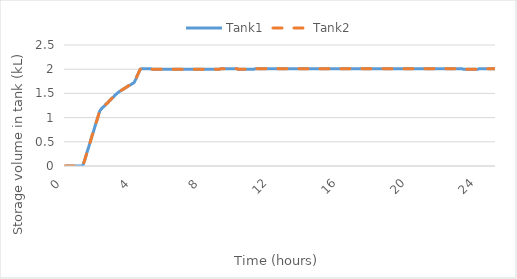
| Category | Tank1 | Tank2 |
|---|---|---|
| 0.0 | 0 | 0 |
| 0.016666666666666666 | 0 | 0 |
| 0.03333333333333333 | 0 | 0 |
| 0.05 | 0 | 0 |
| 0.06666666666666667 | 0 | 0 |
| 0.08333333333333333 | 0 | 0 |
| 0.09999999999999999 | 0 | 0 |
| 0.11666666666666665 | 0 | 0 |
| 0.13333333333333333 | 0 | 0 |
| 0.15 | 0 | 0 |
| 0.16666666666666666 | 0 | 0 |
| 0.18333333333333332 | 0 | 0 |
| 0.19999999999999998 | 0 | 0 |
| 0.21666666666666665 | 0 | 0 |
| 0.2333333333333333 | 0 | 0 |
| 0.24999999999999997 | 0 | 0 |
| 0.26666666666666666 | 0 | 0 |
| 0.2833333333333333 | 0 | 0 |
| 0.3 | 0 | 0 |
| 0.31666666666666665 | 0 | 0 |
| 0.3333333333333333 | 0 | 0 |
| 0.35 | 0 | 0 |
| 0.36666666666666664 | 0 | 0 |
| 0.3833333333333333 | 0 | 0 |
| 0.39999999999999997 | 0 | 0 |
| 0.41666666666666663 | 0 | 0 |
| 0.4333333333333333 | 0 | 0 |
| 0.44999999999999996 | 0 | 0 |
| 0.4666666666666666 | 0 | 0 |
| 0.4833333333333333 | 0 | 0 |
| 0.49999999999999994 | 0 | 0 |
| 0.5166666666666666 | 0 | 0 |
| 0.5333333333333333 | 0 | 0 |
| 0.55 | 0 | 0 |
| 0.5666666666666668 | 0 | 0 |
| 0.5833333333333335 | 0 | 0 |
| 0.6000000000000002 | 0 | 0 |
| 0.6166666666666669 | 0 | 0 |
| 0.6333333333333336 | 0 | 0 |
| 0.6500000000000004 | 0 | 0 |
| 0.6666666666666671 | 0 | 0 |
| 0.6833333333333338 | 0 | 0 |
| 0.7000000000000005 | 0 | 0 |
| 0.7166666666666672 | 0 | 0 |
| 0.733333333333334 | 0 | 0 |
| 0.7500000000000007 | 0 | 0 |
| 0.7666666666666674 | 0 | 0 |
| 0.7833333333333341 | 0 | 0 |
| 0.8000000000000008 | 0 | 0 |
| 0.8166666666666675 | 0 | 0 |
| 0.8333333333333343 | 0 | 0 |
| 0.850000000000001 | 0 | 0 |
| 0.8666666666666677 | 0 | 0 |
| 0.8833333333333344 | 0 | 0 |
| 0.9000000000000011 | 0 | 0 |
| 0.9166666666666679 | 0 | 0 |
| 0.9333333333333346 | 0 | 0 |
| 0.9500000000000013 | 0 | 0 |
| 0.966666666666668 | 0 | 0 |
| 0.9833333333333347 | 0 | 0 |
| 1.0000000000000013 | 0 | 0 |
| 1.016666666666668 | 0.01 | 0.01 |
| 1.0333333333333345 | 0.02 | 0.02 |
| 1.0500000000000012 | 0.03 | 0.03 |
| 1.0666666666666678 | 0.05 | 0.05 |
| 1.0833333333333344 | 0.07 | 0.07 |
| 1.100000000000001 | 0.08 | 0.08 |
| 1.1166666666666676 | 0.1 | 0.1 |
| 1.1333333333333342 | 0.12 | 0.12 |
| 1.1500000000000008 | 0.14 | 0.14 |
| 1.1666666666666674 | 0.16 | 0.16 |
| 1.183333333333334 | 0.18 | 0.18 |
| 1.2000000000000006 | 0.2 | 0.2 |
| 1.2166666666666672 | 0.22 | 0.22 |
| 1.2333333333333338 | 0.24 | 0.24 |
| 1.2500000000000004 | 0.26 | 0.26 |
| 1.266666666666667 | 0.28 | 0.28 |
| 1.2833333333333337 | 0.3 | 0.3 |
| 1.3000000000000003 | 0.32 | 0.32 |
| 1.3166666666666669 | 0.34 | 0.34 |
| 1.3333333333333335 | 0.35 | 0.35 |
| 1.35 | 0.37 | 0.37 |
| 1.3666666666666667 | 0.39 | 0.39 |
| 1.3833333333333333 | 0.41 | 0.41 |
| 1.4 | 0.43 | 0.43 |
| 1.4166666666666665 | 0.45 | 0.45 |
| 1.4333333333333331 | 0.47 | 0.47 |
| 1.4499999999999997 | 0.49 | 0.49 |
| 1.4666666666666663 | 0.51 | 0.51 |
| 1.483333333333333 | 0.53 | 0.53 |
| 1.4999999999999996 | 0.55 | 0.55 |
| 1.5166666666666662 | 0.57 | 0.57 |
| 1.5333333333333328 | 0.59 | 0.59 |
| 1.5499999999999994 | 0.61 | 0.61 |
| 1.566666666666666 | 0.63 | 0.63 |
| 1.5833333333333326 | 0.65 | 0.65 |
| 1.5999999999999992 | 0.66 | 0.66 |
| 1.6166666666666658 | 0.68 | 0.68 |
| 1.6333333333333324 | 0.7 | 0.7 |
| 1.649999999999999 | 0.72 | 0.72 |
| 1.6666666666666656 | 0.74 | 0.74 |
| 1.6833333333333322 | 0.76 | 0.76 |
| 1.6999999999999988 | 0.78 | 0.78 |
| 1.7166666666666655 | 0.8 | 0.8 |
| 1.733333333333332 | 0.82 | 0.82 |
| 1.7499999999999987 | 0.84 | 0.84 |
| 1.7666666666666653 | 0.86 | 0.86 |
| 1.7833333333333319 | 0.88 | 0.88 |
| 1.7999999999999985 | 0.9 | 0.9 |
| 1.816666666666665 | 0.92 | 0.92 |
| 1.8333333333333317 | 0.94 | 0.94 |
| 1.8499999999999983 | 0.95 | 0.95 |
| 1.866666666666665 | 0.97 | 0.97 |
| 1.8833333333333315 | 0.99 | 0.99 |
| 1.8999999999999981 | 1.01 | 1.01 |
| 1.9166666666666647 | 1.03 | 1.03 |
| 1.9333333333333313 | 1.05 | 1.05 |
| 1.949999999999998 | 1.07 | 1.07 |
| 1.9666666666666646 | 1.09 | 1.09 |
| 1.9833333333333312 | 1.11 | 1.11 |
| 1.9999999999999978 | 1.13 | 1.13 |
| 2.0166666666666644 | 1.14 | 1.14 |
| 2.033333333333331 | 1.15 | 1.15 |
| 2.0499999999999976 | 1.16 | 1.16 |
| 2.066666666666664 | 1.16 | 1.16 |
| 2.083333333333331 | 1.17 | 1.17 |
| 2.0999999999999974 | 1.18 | 1.18 |
| 2.116666666666664 | 1.18 | 1.18 |
| 2.1333333333333306 | 1.19 | 1.19 |
| 2.1499999999999972 | 1.2 | 1.2 |
| 2.166666666666664 | 1.2 | 1.2 |
| 2.1833333333333305 | 1.21 | 1.21 |
| 2.199999999999997 | 1.21 | 1.21 |
| 2.2166666666666637 | 1.22 | 1.22 |
| 2.2333333333333303 | 1.23 | 1.23 |
| 2.249999999999997 | 1.23 | 1.23 |
| 2.2666666666666635 | 1.24 | 1.24 |
| 2.28333333333333 | 1.24 | 1.24 |
| 2.2999999999999967 | 1.25 | 1.25 |
| 2.3166666666666633 | 1.26 | 1.26 |
| 2.33333333333333 | 1.26 | 1.26 |
| 2.3499999999999965 | 1.27 | 1.27 |
| 2.366666666666663 | 1.27 | 1.27 |
| 2.3833333333333298 | 1.28 | 1.28 |
| 2.3999999999999964 | 1.29 | 1.29 |
| 2.416666666666663 | 1.29 | 1.29 |
| 2.4333333333333296 | 1.3 | 1.3 |
| 2.449999999999996 | 1.3 | 1.3 |
| 2.466666666666663 | 1.31 | 1.31 |
| 2.4833333333333294 | 1.31 | 1.31 |
| 2.499999999999996 | 1.32 | 1.32 |
| 2.5166666666666626 | 1.33 | 1.33 |
| 2.533333333333329 | 1.33 | 1.33 |
| 2.549999999999996 | 1.34 | 1.34 |
| 2.5666666666666624 | 1.34 | 1.34 |
| 2.583333333333329 | 1.35 | 1.35 |
| 2.5999999999999956 | 1.36 | 1.36 |
| 2.6166666666666623 | 1.36 | 1.36 |
| 2.633333333333329 | 1.37 | 1.37 |
| 2.6499999999999955 | 1.37 | 1.37 |
| 2.666666666666662 | 1.38 | 1.38 |
| 2.6833333333333287 | 1.39 | 1.39 |
| 2.6999999999999953 | 1.39 | 1.39 |
| 2.716666666666662 | 1.4 | 1.4 |
| 2.7333333333333285 | 1.4 | 1.4 |
| 2.749999999999995 | 1.41 | 1.41 |
| 2.7666666666666617 | 1.42 | 1.42 |
| 2.7833333333333283 | 1.42 | 1.42 |
| 2.799999999999995 | 1.43 | 1.43 |
| 2.8166666666666615 | 1.43 | 1.43 |
| 2.833333333333328 | 1.44 | 1.44 |
| 2.8499999999999948 | 1.45 | 1.45 |
| 2.8666666666666614 | 1.45 | 1.45 |
| 2.883333333333328 | 1.46 | 1.46 |
| 2.8999999999999946 | 1.46 | 1.46 |
| 2.916666666666661 | 1.47 | 1.47 |
| 2.933333333333328 | 1.48 | 1.48 |
| 2.9499999999999944 | 1.48 | 1.48 |
| 2.966666666666661 | 1.49 | 1.49 |
| 2.9833333333333276 | 1.49 | 1.49 |
| 2.9999999999999942 | 1.5 | 1.5 |
| 3.016666666666661 | 1.5 | 1.5 |
| 3.0333333333333274 | 1.51 | 1.51 |
| 3.049999999999994 | 1.51 | 1.51 |
| 3.0666666666666607 | 1.52 | 1.52 |
| 3.0833333333333273 | 1.52 | 1.52 |
| 3.099999999999994 | 1.52 | 1.52 |
| 3.1166666666666605 | 1.53 | 1.53 |
| 3.133333333333327 | 1.53 | 1.53 |
| 3.1499999999999937 | 1.54 | 1.54 |
| 3.1666666666666603 | 1.54 | 1.54 |
| 3.183333333333327 | 1.54 | 1.54 |
| 3.1999999999999935 | 1.55 | 1.55 |
| 3.21666666666666 | 1.55 | 1.55 |
| 3.2333333333333267 | 1.55 | 1.55 |
| 3.2499999999999933 | 1.56 | 1.56 |
| 3.26666666666666 | 1.56 | 1.56 |
| 3.2833333333333266 | 1.57 | 1.57 |
| 3.299999999999993 | 1.57 | 1.57 |
| 3.3166666666666598 | 1.57 | 1.57 |
| 3.3333333333333264 | 1.58 | 1.58 |
| 3.349999999999993 | 1.58 | 1.58 |
| 3.3666666666666596 | 1.58 | 1.58 |
| 3.383333333333326 | 1.59 | 1.59 |
| 3.399999999999993 | 1.59 | 1.59 |
| 3.4166666666666594 | 1.6 | 1.6 |
| 3.433333333333326 | 1.6 | 1.6 |
| 3.4499999999999926 | 1.6 | 1.6 |
| 3.4666666666666592 | 1.61 | 1.61 |
| 3.483333333333326 | 1.61 | 1.61 |
| 3.4999999999999925 | 1.61 | 1.61 |
| 3.516666666666659 | 1.62 | 1.62 |
| 3.5333333333333257 | 1.62 | 1.62 |
| 3.5499999999999923 | 1.63 | 1.63 |
| 3.566666666666659 | 1.63 | 1.63 |
| 3.5833333333333255 | 1.63 | 1.63 |
| 3.599999999999992 | 1.64 | 1.64 |
| 3.6166666666666587 | 1.64 | 1.64 |
| 3.6333333333333253 | 1.64 | 1.64 |
| 3.649999999999992 | 1.65 | 1.65 |
| 3.6666666666666585 | 1.65 | 1.65 |
| 3.683333333333325 | 1.66 | 1.66 |
| 3.6999999999999917 | 1.66 | 1.66 |
| 3.7166666666666583 | 1.66 | 1.66 |
| 3.733333333333325 | 1.67 | 1.67 |
| 3.7499999999999916 | 1.67 | 1.67 |
| 3.766666666666658 | 1.67 | 1.67 |
| 3.7833333333333248 | 1.68 | 1.68 |
| 3.7999999999999914 | 1.68 | 1.68 |
| 3.816666666666658 | 1.68 | 1.68 |
| 3.8333333333333246 | 1.69 | 1.69 |
| 3.849999999999991 | 1.69 | 1.69 |
| 3.866666666666658 | 1.7 | 1.7 |
| 3.8833333333333244 | 1.7 | 1.7 |
| 3.899999999999991 | 1.7 | 1.7 |
| 3.9166666666666576 | 1.71 | 1.71 |
| 3.9333333333333242 | 1.71 | 1.71 |
| 3.949999999999991 | 1.71 | 1.71 |
| 3.9666666666666575 | 1.72 | 1.72 |
| 3.983333333333324 | 1.72 | 1.72 |
| 3.9999999999999907 | 1.73 | 1.73 |
| 4.016666666666658 | 1.73 | 1.73 |
| 4.033333333333324 | 1.74 | 1.74 |
| 4.049999999999991 | 1.76 | 1.76 |
| 4.0666666666666575 | 1.77 | 1.77 |
| 4.083333333333324 | 1.78 | 1.78 |
| 4.099999999999991 | 1.79 | 1.79 |
| 4.116666666666657 | 1.81 | 1.81 |
| 4.133333333333324 | 1.82 | 1.82 |
| 4.149999999999991 | 1.83 | 1.83 |
| 4.166666666666657 | 1.85 | 1.85 |
| 4.183333333333324 | 1.86 | 1.86 |
| 4.19999999999999 | 1.87 | 1.87 |
| 4.216666666666657 | 1.89 | 1.89 |
| 4.233333333333324 | 1.9 | 1.9 |
| 4.24999999999999 | 1.91 | 1.91 |
| 4.266666666666657 | 1.93 | 1.93 |
| 4.2833333333333234 | 1.94 | 1.94 |
| 4.29999999999999 | 1.95 | 1.95 |
| 4.316666666666657 | 1.97 | 1.97 |
| 4.333333333333323 | 1.98 | 1.98 |
| 4.34999999999999 | 1.99 | 1.99 |
| 4.3666666666666565 | 2 | 2 |
| 4.383333333333323 | 2.01 | 2.01 |
| 4.39999999999999 | 2.01 | 2.01 |
| 4.416666666666656 | 2.01 | 2.01 |
| 4.433333333333323 | 2.01 | 2.01 |
| 4.4499999999999895 | 2.01 | 2.01 |
| 4.466666666666656 | 2.01 | 2.01 |
| 4.483333333333323 | 2.01 | 2.01 |
| 4.499999999999989 | 2.01 | 2.01 |
| 4.516666666666656 | 2.01 | 2.01 |
| 4.533333333333323 | 2.01 | 2.01 |
| 4.549999999999989 | 2.01 | 2.01 |
| 4.566666666666656 | 2.01 | 2.01 |
| 4.583333333333322 | 2.01 | 2.01 |
| 4.599999999999989 | 2.01 | 2.01 |
| 4.616666666666656 | 2.01 | 2.01 |
| 4.633333333333322 | 2.01 | 2.01 |
| 4.649999999999989 | 2.01 | 2.01 |
| 4.666666666666655 | 2.01 | 2.01 |
| 4.683333333333322 | 2.01 | 2.01 |
| 4.699999999999989 | 2.01 | 2.01 |
| 4.716666666666655 | 2.01 | 2.01 |
| 4.733333333333322 | 2.01 | 2.01 |
| 4.7499999999999885 | 2.01 | 2.01 |
| 4.766666666666655 | 2.01 | 2.01 |
| 4.783333333333322 | 2.01 | 2.01 |
| 4.799999999999988 | 2.01 | 2.01 |
| 4.816666666666655 | 2.01 | 2.01 |
| 4.8333333333333215 | 2.01 | 2.01 |
| 4.849999999999988 | 2.01 | 2.01 |
| 4.866666666666655 | 2.01 | 2.01 |
| 4.883333333333321 | 2.01 | 2.01 |
| 4.899999999999988 | 2.01 | 2.01 |
| 4.9166666666666545 | 2.01 | 2.01 |
| 4.933333333333321 | 2.01 | 2.01 |
| 4.949999999999988 | 2.01 | 2.01 |
| 4.966666666666654 | 2.01 | 2.01 |
| 4.983333333333321 | 2.01 | 2.01 |
| 4.999999999999988 | 2.01 | 2.01 |
| 5.016666666666654 | 2 | 2 |
| 5.033333333333321 | 2 | 2 |
| 5.049999999999987 | 2 | 2 |
| 5.066666666666654 | 2 | 2 |
| 5.083333333333321 | 2 | 2 |
| 5.099999999999987 | 2 | 2 |
| 5.116666666666654 | 2 | 2 |
| 5.13333333333332 | 2 | 2 |
| 5.149999999999987 | 2 | 2 |
| 5.166666666666654 | 2 | 2 |
| 5.18333333333332 | 2 | 2 |
| 5.199999999999987 | 2 | 2 |
| 5.2166666666666535 | 2 | 2 |
| 5.23333333333332 | 2 | 2 |
| 5.249999999999987 | 2 | 2 |
| 5.266666666666653 | 2 | 2 |
| 5.28333333333332 | 2 | 2 |
| 5.2999999999999865 | 2 | 2 |
| 5.316666666666653 | 2 | 2 |
| 5.33333333333332 | 2 | 2 |
| 5.349999999999986 | 2 | 2 |
| 5.366666666666653 | 2 | 2 |
| 5.3833333333333195 | 2 | 2 |
| 5.399999999999986 | 2 | 2 |
| 5.416666666666653 | 2 | 2 |
| 5.433333333333319 | 2 | 2 |
| 5.449999999999986 | 2 | 2 |
| 5.466666666666653 | 2 | 2 |
| 5.483333333333319 | 2 | 2 |
| 5.499999999999986 | 2 | 2 |
| 5.516666666666652 | 2 | 2 |
| 5.533333333333319 | 2 | 2 |
| 5.549999999999986 | 2 | 2 |
| 5.566666666666652 | 2 | 2 |
| 5.583333333333319 | 2 | 2 |
| 5.599999999999985 | 2 | 2 |
| 5.616666666666652 | 2 | 2 |
| 5.633333333333319 | 2 | 2 |
| 5.649999999999985 | 2 | 2 |
| 5.666666666666652 | 2 | 2 |
| 5.6833333333333185 | 2 | 2 |
| 5.699999999999985 | 2 | 2 |
| 5.716666666666652 | 2 | 2 |
| 5.733333333333318 | 2 | 2 |
| 5.749999999999985 | 2 | 2 |
| 5.7666666666666515 | 2 | 2 |
| 5.783333333333318 | 2 | 2 |
| 5.799999999999985 | 2 | 2 |
| 5.816666666666651 | 2 | 2 |
| 5.833333333333318 | 2 | 2 |
| 5.8499999999999845 | 2 | 2 |
| 5.866666666666651 | 2 | 2 |
| 5.883333333333318 | 2 | 2 |
| 5.899999999999984 | 2 | 2 |
| 5.916666666666651 | 2 | 2 |
| 5.933333333333318 | 2 | 2 |
| 5.949999999999984 | 2 | 2 |
| 5.966666666666651 | 2 | 2 |
| 5.983333333333317 | 2 | 2 |
| 5.999999999999984 | 2 | 2 |
| 6.016666666666651 | 2 | 2 |
| 6.033333333333317 | 2 | 2 |
| 6.049999999999984 | 2 | 2 |
| 6.06666666666665 | 2 | 2 |
| 6.083333333333317 | 2 | 2 |
| 6.099999999999984 | 2 | 2 |
| 6.11666666666665 | 2 | 2 |
| 6.133333333333317 | 2 | 2 |
| 6.1499999999999835 | 2 | 2 |
| 6.16666666666665 | 2 | 2 |
| 6.183333333333317 | 2 | 2 |
| 6.199999999999983 | 2 | 2 |
| 6.21666666666665 | 2 | 2 |
| 6.2333333333333165 | 2 | 2 |
| 6.249999999999983 | 2 | 2 |
| 6.26666666666665 | 2 | 2 |
| 6.283333333333316 | 2 | 2 |
| 6.299999999999983 | 2 | 2 |
| 6.3166666666666496 | 2 | 2 |
| 6.333333333333316 | 2 | 2 |
| 6.349999999999983 | 2 | 2 |
| 6.366666666666649 | 2 | 2 |
| 6.383333333333316 | 2 | 2 |
| 6.399999999999983 | 2 | 2 |
| 6.416666666666649 | 2 | 2 |
| 6.433333333333316 | 2 | 2 |
| 6.449999999999982 | 2 | 2 |
| 6.466666666666649 | 2 | 2 |
| 6.483333333333316 | 2 | 2 |
| 6.499999999999982 | 2 | 2 |
| 6.516666666666649 | 2 | 2 |
| 6.5333333333333155 | 2 | 2 |
| 6.549999999999982 | 2 | 2 |
| 6.566666666666649 | 2 | 2 |
| 6.583333333333315 | 2 | 2 |
| 6.599999999999982 | 2 | 2 |
| 6.6166666666666485 | 2 | 2 |
| 6.633333333333315 | 2 | 2 |
| 6.649999999999982 | 2 | 2 |
| 6.666666666666648 | 2 | 2 |
| 6.683333333333315 | 2 | 2 |
| 6.6999999999999815 | 2 | 2 |
| 6.716666666666648 | 2 | 2 |
| 6.733333333333315 | 2 | 2 |
| 6.749999999999981 | 2 | 2 |
| 6.766666666666648 | 2 | 2 |
| 6.783333333333315 | 2 | 2 |
| 6.799999999999981 | 2 | 2 |
| 6.816666666666648 | 2 | 2 |
| 6.833333333333314 | 2 | 2 |
| 6.849999999999981 | 2 | 2 |
| 6.866666666666648 | 2 | 2 |
| 6.883333333333314 | 2 | 2 |
| 6.899999999999981 | 2 | 2 |
| 6.916666666666647 | 2 | 2 |
| 6.933333333333314 | 2 | 2 |
| 6.949999999999981 | 2 | 2 |
| 6.966666666666647 | 2 | 2 |
| 6.983333333333314 | 2 | 2 |
| 6.9999999999999805 | 2 | 2 |
| 7.016666666666647 | 2 | 2 |
| 7.033333333333314 | 2 | 2 |
| 7.04999999999998 | 2 | 2 |
| 7.066666666666647 | 2 | 2 |
| 7.0833333333333135 | 2 | 2 |
| 7.09999999999998 | 2 | 2 |
| 7.116666666666647 | 2 | 2 |
| 7.133333333333313 | 2 | 2 |
| 7.14999999999998 | 2 | 2 |
| 7.1666666666666465 | 2 | 2 |
| 7.183333333333313 | 2 | 2 |
| 7.19999999999998 | 2 | 2 |
| 7.216666666666646 | 2 | 2 |
| 7.233333333333313 | 2 | 2 |
| 7.24999999999998 | 2 | 2 |
| 7.266666666666646 | 2 | 2 |
| 7.283333333333313 | 2 | 2 |
| 7.299999999999979 | 2 | 2 |
| 7.316666666666646 | 2 | 2 |
| 7.333333333333313 | 2 | 2 |
| 7.349999999999979 | 2 | 2 |
| 7.366666666666646 | 2 | 2 |
| 7.383333333333312 | 2 | 2 |
| 7.399999999999979 | 2 | 2 |
| 7.416666666666646 | 2 | 2 |
| 7.433333333333312 | 2 | 2 |
| 7.449999999999979 | 2 | 2 |
| 7.4666666666666455 | 2 | 2 |
| 7.483333333333312 | 2 | 2 |
| 7.499999999999979 | 2 | 2 |
| 7.516666666666645 | 2 | 2 |
| 7.533333333333312 | 2 | 2 |
| 7.5499999999999785 | 2 | 2 |
| 7.566666666666645 | 2 | 2 |
| 7.583333333333312 | 2 | 2 |
| 7.599999999999978 | 2 | 2 |
| 7.616666666666645 | 2 | 2 |
| 7.6333333333333115 | 2 | 2 |
| 7.649999999999978 | 2 | 2 |
| 7.666666666666645 | 2 | 2 |
| 7.683333333333311 | 2 | 2 |
| 7.699999999999978 | 2 | 2 |
| 7.716666666666645 | 2 | 2 |
| 7.733333333333311 | 2 | 2 |
| 7.749999999999978 | 2 | 2 |
| 7.766666666666644 | 2 | 2 |
| 7.783333333333311 | 2 | 2 |
| 7.799999999999978 | 2 | 2 |
| 7.816666666666644 | 2 | 2 |
| 7.833333333333311 | 2 | 2 |
| 7.849999999999977 | 2 | 2 |
| 7.866666666666644 | 2 | 2 |
| 7.883333333333311 | 2 | 2 |
| 7.899999999999977 | 2 | 2 |
| 7.916666666666644 | 2 | 2 |
| 7.9333333333333105 | 2 | 2 |
| 7.949999999999977 | 2 | 2 |
| 7.966666666666644 | 2 | 2 |
| 7.98333333333331 | 2 | 2 |
| 7.999999999999977 | 2 | 2 |
| 8.016666666666644 | 2 | 2 |
| 8.033333333333312 | 2 | 2 |
| 8.04999999999998 | 2 | 2 |
| 8.066666666666647 | 2 | 2 |
| 8.083333333333314 | 2 | 2 |
| 8.099999999999982 | 2 | 2 |
| 8.11666666666665 | 2 | 2 |
| 8.133333333333317 | 2 | 2 |
| 8.149999999999984 | 2 | 2 |
| 8.166666666666652 | 2 | 2 |
| 8.18333333333332 | 2 | 2 |
| 8.199999999999987 | 2 | 2 |
| 8.216666666666654 | 2 | 2 |
| 8.233333333333322 | 2 | 2 |
| 8.24999999999999 | 2 | 2 |
| 8.266666666666657 | 2 | 2 |
| 8.283333333333324 | 2 | 2 |
| 8.299999999999992 | 2 | 2 |
| 8.31666666666666 | 2 | 2 |
| 8.333333333333327 | 2 | 2 |
| 8.349999999999994 | 2 | 2 |
| 8.366666666666662 | 2 | 2 |
| 8.38333333333333 | 2 | 2 |
| 8.399999999999997 | 2 | 2 |
| 8.416666666666664 | 2 | 2 |
| 8.433333333333332 | 2 | 2 |
| 8.45 | 2 | 2 |
| 8.466666666666667 | 2 | 2 |
| 8.483333333333334 | 2 | 2 |
| 8.500000000000002 | 2 | 2 |
| 8.51666666666667 | 2 | 2 |
| 8.533333333333337 | 2 | 2 |
| 8.550000000000004 | 2 | 2 |
| 8.566666666666672 | 2 | 2 |
| 8.58333333333334 | 2 | 2 |
| 8.600000000000007 | 2 | 2 |
| 8.616666666666674 | 2 | 2 |
| 8.633333333333342 | 2 | 2 |
| 8.65000000000001 | 2 | 2 |
| 8.666666666666677 | 2 | 2 |
| 8.683333333333344 | 2 | 2 |
| 8.700000000000012 | 2 | 2 |
| 8.71666666666668 | 2 | 2 |
| 8.733333333333347 | 2 | 2 |
| 8.750000000000014 | 2 | 2 |
| 8.766666666666682 | 2 | 2 |
| 8.78333333333335 | 2 | 2 |
| 8.800000000000017 | 2 | 2 |
| 8.816666666666684 | 2 | 2 |
| 8.833333333333352 | 2 | 2 |
| 8.85000000000002 | 2 | 2 |
| 8.866666666666687 | 2 | 2 |
| 8.883333333333354 | 2 | 2 |
| 8.900000000000022 | 2 | 2 |
| 8.91666666666669 | 2 | 2 |
| 8.933333333333357 | 2 | 2 |
| 8.950000000000024 | 2 | 2 |
| 8.966666666666692 | 2 | 2 |
| 8.98333333333336 | 2 | 2 |
| 9.000000000000027 | 2 | 2 |
| 9.016666666666694 | 2.01 | 2.01 |
| 9.033333333333362 | 2.01 | 2.01 |
| 9.05000000000003 | 2.01 | 2.01 |
| 9.066666666666697 | 2.01 | 2.01 |
| 9.083333333333364 | 2.01 | 2.01 |
| 9.100000000000032 | 2.01 | 2.01 |
| 9.1166666666667 | 2.01 | 2.01 |
| 9.133333333333367 | 2.01 | 2.01 |
| 9.150000000000034 | 2.01 | 2.01 |
| 9.166666666666702 | 2.01 | 2.01 |
| 9.183333333333369 | 2.01 | 2.01 |
| 9.200000000000037 | 2.01 | 2.01 |
| 9.216666666666704 | 2.01 | 2.01 |
| 9.233333333333372 | 2.01 | 2.01 |
| 9.250000000000039 | 2.01 | 2.01 |
| 9.266666666666707 | 2.01 | 2.01 |
| 9.283333333333374 | 2.01 | 2.01 |
| 9.300000000000042 | 2.01 | 2.01 |
| 9.316666666666709 | 2.01 | 2.01 |
| 9.333333333333377 | 2.01 | 2.01 |
| 9.350000000000044 | 2.01 | 2.01 |
| 9.366666666666712 | 2.01 | 2.01 |
| 9.383333333333379 | 2.01 | 2.01 |
| 9.400000000000047 | 2.01 | 2.01 |
| 9.416666666666714 | 2.01 | 2.01 |
| 9.433333333333382 | 2.01 | 2.01 |
| 9.450000000000049 | 2.01 | 2.01 |
| 9.466666666666717 | 2.01 | 2.01 |
| 9.483333333333384 | 2.01 | 2.01 |
| 9.500000000000052 | 2.01 | 2.01 |
| 9.516666666666719 | 2.01 | 2.01 |
| 9.533333333333387 | 2.01 | 2.01 |
| 9.550000000000054 | 2.01 | 2.01 |
| 9.566666666666721 | 2.01 | 2.01 |
| 9.583333333333389 | 2.01 | 2.01 |
| 9.600000000000056 | 2.01 | 2.01 |
| 9.616666666666724 | 2.01 | 2.01 |
| 9.633333333333391 | 2.01 | 2.01 |
| 9.650000000000059 | 2.01 | 2.01 |
| 9.666666666666726 | 2.01 | 2.01 |
| 9.683333333333394 | 2.01 | 2.01 |
| 9.700000000000061 | 2.01 | 2.01 |
| 9.716666666666729 | 2.01 | 2.01 |
| 9.733333333333396 | 2.01 | 2.01 |
| 9.750000000000064 | 2.01 | 2.01 |
| 9.766666666666731 | 2.01 | 2.01 |
| 9.783333333333399 | 2.01 | 2.01 |
| 9.800000000000066 | 2.01 | 2.01 |
| 9.816666666666734 | 2.01 | 2.01 |
| 9.833333333333401 | 2.01 | 2.01 |
| 9.850000000000069 | 2.01 | 2.01 |
| 9.866666666666736 | 2.01 | 2.01 |
| 9.883333333333404 | 2.01 | 2.01 |
| 9.900000000000071 | 2.01 | 2.01 |
| 9.916666666666739 | 2.01 | 2.01 |
| 9.933333333333406 | 2.01 | 2.01 |
| 9.950000000000074 | 2.01 | 2.01 |
| 9.966666666666741 | 2.01 | 2.01 |
| 9.983333333333409 | 2.01 | 2.01 |
| 10.000000000000076 | 2.01 | 2.01 |
| 10.016666666666744 | 2.01 | 2.01 |
| 10.033333333333411 | 2 | 2 |
| 10.050000000000079 | 2 | 2 |
| 10.066666666666746 | 2 | 2 |
| 10.083333333333414 | 2 | 2 |
| 10.100000000000081 | 2 | 2 |
| 10.116666666666749 | 2 | 2 |
| 10.133333333333416 | 2 | 2 |
| 10.150000000000084 | 2 | 2 |
| 10.166666666666751 | 2 | 2 |
| 10.183333333333419 | 2 | 2 |
| 10.200000000000086 | 2 | 2 |
| 10.216666666666754 | 2 | 2 |
| 10.233333333333421 | 2 | 2 |
| 10.250000000000089 | 2 | 2 |
| 10.266666666666756 | 2 | 2 |
| 10.283333333333424 | 2 | 2 |
| 10.300000000000091 | 2 | 2 |
| 10.316666666666759 | 2 | 2 |
| 10.333333333333426 | 2 | 2 |
| 10.350000000000094 | 2 | 2 |
| 10.366666666666761 | 2 | 2 |
| 10.383333333333429 | 2 | 2 |
| 10.400000000000096 | 2 | 2 |
| 10.416666666666764 | 2 | 2 |
| 10.433333333333431 | 2 | 2 |
| 10.450000000000099 | 2 | 2 |
| 10.466666666666766 | 2 | 2 |
| 10.483333333333434 | 2 | 2 |
| 10.500000000000101 | 2 | 2 |
| 10.516666666666769 | 2 | 2 |
| 10.533333333333436 | 2 | 2 |
| 10.550000000000104 | 2 | 2 |
| 10.566666666666771 | 2 | 2 |
| 10.583333333333439 | 2 | 2 |
| 10.600000000000106 | 2 | 2 |
| 10.616666666666774 | 2 | 2 |
| 10.633333333333441 | 2 | 2 |
| 10.650000000000109 | 2 | 2 |
| 10.666666666666776 | 2 | 2 |
| 10.683333333333444 | 2 | 2 |
| 10.700000000000111 | 2 | 2 |
| 10.716666666666779 | 2 | 2 |
| 10.733333333333446 | 2 | 2 |
| 10.750000000000114 | 2 | 2 |
| 10.766666666666781 | 2 | 2 |
| 10.783333333333449 | 2 | 2 |
| 10.800000000000116 | 2 | 2 |
| 10.816666666666784 | 2 | 2 |
| 10.833333333333451 | 2 | 2 |
| 10.850000000000119 | 2 | 2 |
| 10.866666666666786 | 2 | 2 |
| 10.883333333333454 | 2 | 2 |
| 10.900000000000121 | 2 | 2 |
| 10.916666666666789 | 2 | 2 |
| 10.933333333333456 | 2 | 2 |
| 10.950000000000124 | 2 | 2 |
| 10.966666666666791 | 2 | 2 |
| 10.983333333333459 | 2 | 2 |
| 11.000000000000126 | 2.01 | 2.01 |
| 11.016666666666794 | 2.01 | 2.01 |
| 11.033333333333461 | 2.01 | 2.01 |
| 11.050000000000129 | 2.01 | 2.01 |
| 11.066666666666796 | 2.01 | 2.01 |
| 11.083333333333464 | 2.01 | 2.01 |
| 11.100000000000131 | 2.01 | 2.01 |
| 11.116666666666799 | 2.01 | 2.01 |
| 11.133333333333466 | 2.01 | 2.01 |
| 11.150000000000134 | 2.01 | 2.01 |
| 11.166666666666801 | 2.01 | 2.01 |
| 11.183333333333469 | 2.01 | 2.01 |
| 11.200000000000136 | 2.01 | 2.01 |
| 11.216666666666804 | 2.01 | 2.01 |
| 11.233333333333471 | 2.01 | 2.01 |
| 11.250000000000139 | 2.01 | 2.01 |
| 11.266666666666806 | 2.01 | 2.01 |
| 11.283333333333474 | 2.01 | 2.01 |
| 11.300000000000141 | 2.01 | 2.01 |
| 11.316666666666809 | 2.01 | 2.01 |
| 11.333333333333476 | 2.01 | 2.01 |
| 11.350000000000144 | 2.01 | 2.01 |
| 11.366666666666811 | 2.01 | 2.01 |
| 11.383333333333479 | 2.01 | 2.01 |
| 11.400000000000146 | 2.01 | 2.01 |
| 11.416666666666814 | 2.01 | 2.01 |
| 11.433333333333481 | 2.01 | 2.01 |
| 11.450000000000149 | 2.01 | 2.01 |
| 11.466666666666816 | 2.01 | 2.01 |
| 11.483333333333483 | 2.01 | 2.01 |
| 11.500000000000151 | 2.01 | 2.01 |
| 11.516666666666818 | 2.01 | 2.01 |
| 11.533333333333486 | 2.01 | 2.01 |
| 11.550000000000153 | 2.01 | 2.01 |
| 11.566666666666821 | 2.01 | 2.01 |
| 11.583333333333488 | 2.01 | 2.01 |
| 11.600000000000156 | 2.01 | 2.01 |
| 11.616666666666823 | 2.01 | 2.01 |
| 11.633333333333491 | 2.01 | 2.01 |
| 11.650000000000158 | 2.01 | 2.01 |
| 11.666666666666826 | 2.01 | 2.01 |
| 11.683333333333493 | 2.01 | 2.01 |
| 11.700000000000161 | 2.01 | 2.01 |
| 11.716666666666828 | 2.01 | 2.01 |
| 11.733333333333496 | 2.01 | 2.01 |
| 11.750000000000163 | 2.01 | 2.01 |
| 11.766666666666831 | 2.01 | 2.01 |
| 11.783333333333498 | 2.01 | 2.01 |
| 11.800000000000166 | 2.01 | 2.01 |
| 11.816666666666833 | 2.01 | 2.01 |
| 11.833333333333501 | 2.01 | 2.01 |
| 11.850000000000168 | 2.01 | 2.01 |
| 11.866666666666836 | 2.01 | 2.01 |
| 11.883333333333503 | 2.01 | 2.01 |
| 11.90000000000017 | 2.01 | 2.01 |
| 11.916666666666838 | 2.01 | 2.01 |
| 11.933333333333506 | 2.01 | 2.01 |
| 11.950000000000173 | 2.01 | 2.01 |
| 11.96666666666684 | 2.01 | 2.01 |
| 11.983333333333508 | 2.01 | 2.01 |
| 12.000000000000176 | 2.01 | 2.01 |
| 12.016666666666843 | 2.01 | 2.01 |
| 12.03333333333351 | 2.01 | 2.01 |
| 12.050000000000178 | 2.01 | 2.01 |
| 12.066666666666846 | 2.01 | 2.01 |
| 12.083333333333513 | 2.01 | 2.01 |
| 12.10000000000018 | 2.01 | 2.01 |
| 12.116666666666848 | 2.01 | 2.01 |
| 12.133333333333516 | 2.01 | 2.01 |
| 12.150000000000183 | 2.01 | 2.01 |
| 12.16666666666685 | 2.01 | 2.01 |
| 12.183333333333518 | 2.01 | 2.01 |
| 12.200000000000186 | 2.01 | 2.01 |
| 12.216666666666853 | 2.01 | 2.01 |
| 12.23333333333352 | 2.01 | 2.01 |
| 12.250000000000188 | 2.01 | 2.01 |
| 12.266666666666856 | 2.01 | 2.01 |
| 12.283333333333523 | 2.01 | 2.01 |
| 12.30000000000019 | 2.01 | 2.01 |
| 12.316666666666858 | 2.01 | 2.01 |
| 12.333333333333526 | 2.01 | 2.01 |
| 12.350000000000193 | 2.01 | 2.01 |
| 12.36666666666686 | 2.01 | 2.01 |
| 12.383333333333528 | 2.01 | 2.01 |
| 12.400000000000196 | 2.01 | 2.01 |
| 12.416666666666863 | 2.01 | 2.01 |
| 12.43333333333353 | 2.01 | 2.01 |
| 12.450000000000198 | 2.01 | 2.01 |
| 12.466666666666866 | 2.01 | 2.01 |
| 12.483333333333533 | 2.01 | 2.01 |
| 12.5000000000002 | 2.01 | 2.01 |
| 12.516666666666868 | 2.01 | 2.01 |
| 12.533333333333536 | 2.01 | 2.01 |
| 12.550000000000203 | 2.01 | 2.01 |
| 12.56666666666687 | 2.01 | 2.01 |
| 12.583333333333538 | 2.01 | 2.01 |
| 12.600000000000206 | 2.01 | 2.01 |
| 12.616666666666873 | 2.01 | 2.01 |
| 12.63333333333354 | 2.01 | 2.01 |
| 12.650000000000208 | 2.01 | 2.01 |
| 12.666666666666876 | 2.01 | 2.01 |
| 12.683333333333543 | 2.01 | 2.01 |
| 12.70000000000021 | 2.01 | 2.01 |
| 12.716666666666878 | 2.01 | 2.01 |
| 12.733333333333546 | 2.01 | 2.01 |
| 12.750000000000213 | 2.01 | 2.01 |
| 12.76666666666688 | 2.01 | 2.01 |
| 12.783333333333548 | 2.01 | 2.01 |
| 12.800000000000216 | 2.01 | 2.01 |
| 12.816666666666883 | 2.01 | 2.01 |
| 12.83333333333355 | 2.01 | 2.01 |
| 12.850000000000218 | 2.01 | 2.01 |
| 12.866666666666886 | 2.01 | 2.01 |
| 12.883333333333553 | 2.01 | 2.01 |
| 12.90000000000022 | 2.01 | 2.01 |
| 12.916666666666888 | 2.01 | 2.01 |
| 12.933333333333556 | 2.01 | 2.01 |
| 12.950000000000223 | 2.01 | 2.01 |
| 12.96666666666689 | 2.01 | 2.01 |
| 12.983333333333558 | 2.01 | 2.01 |
| 13.000000000000226 | 2.01 | 2.01 |
| 13.016666666666893 | 2.01 | 2.01 |
| 13.03333333333356 | 2.01 | 2.01 |
| 13.050000000000228 | 2.01 | 2.01 |
| 13.066666666666896 | 2.01 | 2.01 |
| 13.083333333333563 | 2.01 | 2.01 |
| 13.10000000000023 | 2.01 | 2.01 |
| 13.116666666666898 | 2.01 | 2.01 |
| 13.133333333333566 | 2.01 | 2.01 |
| 13.150000000000233 | 2.01 | 2.01 |
| 13.1666666666669 | 2.01 | 2.01 |
| 13.183333333333568 | 2.01 | 2.01 |
| 13.200000000000236 | 2.01 | 2.01 |
| 13.216666666666903 | 2.01 | 2.01 |
| 13.23333333333357 | 2.01 | 2.01 |
| 13.250000000000238 | 2.01 | 2.01 |
| 13.266666666666906 | 2.01 | 2.01 |
| 13.283333333333573 | 2.01 | 2.01 |
| 13.30000000000024 | 2.01 | 2.01 |
| 13.316666666666908 | 2.01 | 2.01 |
| 13.333333333333576 | 2.01 | 2.01 |
| 13.350000000000243 | 2.01 | 2.01 |
| 13.36666666666691 | 2.01 | 2.01 |
| 13.383333333333578 | 2.01 | 2.01 |
| 13.400000000000245 | 2.01 | 2.01 |
| 13.416666666666913 | 2.01 | 2.01 |
| 13.43333333333358 | 2.01 | 2.01 |
| 13.450000000000248 | 2.01 | 2.01 |
| 13.466666666666915 | 2.01 | 2.01 |
| 13.483333333333583 | 2.01 | 2.01 |
| 13.50000000000025 | 2.01 | 2.01 |
| 13.516666666666918 | 2.01 | 2.01 |
| 13.533333333333585 | 2.01 | 2.01 |
| 13.550000000000253 | 2.01 | 2.01 |
| 13.56666666666692 | 2.01 | 2.01 |
| 13.583333333333588 | 2.01 | 2.01 |
| 13.600000000000255 | 2.01 | 2.01 |
| 13.616666666666923 | 2.01 | 2.01 |
| 13.63333333333359 | 2.01 | 2.01 |
| 13.650000000000258 | 2.01 | 2.01 |
| 13.666666666666925 | 2.01 | 2.01 |
| 13.683333333333593 | 2.01 | 2.01 |
| 13.70000000000026 | 2.01 | 2.01 |
| 13.716666666666928 | 2.01 | 2.01 |
| 13.733333333333595 | 2.01 | 2.01 |
| 13.750000000000263 | 2.01 | 2.01 |
| 13.76666666666693 | 2.01 | 2.01 |
| 13.783333333333598 | 2.01 | 2.01 |
| 13.800000000000265 | 2.01 | 2.01 |
| 13.816666666666933 | 2.01 | 2.01 |
| 13.8333333333336 | 2.01 | 2.01 |
| 13.850000000000268 | 2.01 | 2.01 |
| 13.866666666666935 | 2.01 | 2.01 |
| 13.883333333333603 | 2.01 | 2.01 |
| 13.90000000000027 | 2.01 | 2.01 |
| 13.916666666666938 | 2.01 | 2.01 |
| 13.933333333333605 | 2.01 | 2.01 |
| 13.950000000000273 | 2.01 | 2.01 |
| 13.96666666666694 | 2.01 | 2.01 |
| 13.983333333333608 | 2.01 | 2.01 |
| 14.000000000000275 | 2.01 | 2.01 |
| 14.016666666666943 | 2.01 | 2.01 |
| 14.03333333333361 | 2.01 | 2.01 |
| 14.050000000000278 | 2.01 | 2.01 |
| 14.066666666666945 | 2.01 | 2.01 |
| 14.083333333333613 | 2.01 | 2.01 |
| 14.10000000000028 | 2.01 | 2.01 |
| 14.116666666666948 | 2.01 | 2.01 |
| 14.133333333333615 | 2.01 | 2.01 |
| 14.150000000000283 | 2.01 | 2.01 |
| 14.16666666666695 | 2.01 | 2.01 |
| 14.183333333333618 | 2.01 | 2.01 |
| 14.200000000000285 | 2.01 | 2.01 |
| 14.216666666666953 | 2.01 | 2.01 |
| 14.23333333333362 | 2.01 | 2.01 |
| 14.250000000000288 | 2.01 | 2.01 |
| 14.266666666666955 | 2.01 | 2.01 |
| 14.283333333333623 | 2.01 | 2.01 |
| 14.30000000000029 | 2.01 | 2.01 |
| 14.316666666666958 | 2.01 | 2.01 |
| 14.333333333333625 | 2.01 | 2.01 |
| 14.350000000000293 | 2.01 | 2.01 |
| 14.36666666666696 | 2.01 | 2.01 |
| 14.383333333333628 | 2.01 | 2.01 |
| 14.400000000000295 | 2.01 | 2.01 |
| 14.416666666666963 | 2.01 | 2.01 |
| 14.43333333333363 | 2.01 | 2.01 |
| 14.450000000000298 | 2.01 | 2.01 |
| 14.466666666666965 | 2.01 | 2.01 |
| 14.483333333333633 | 2.01 | 2.01 |
| 14.5000000000003 | 2.01 | 2.01 |
| 14.516666666666968 | 2.01 | 2.01 |
| 14.533333333333635 | 2.01 | 2.01 |
| 14.550000000000303 | 2.01 | 2.01 |
| 14.56666666666697 | 2.01 | 2.01 |
| 14.583333333333638 | 2.01 | 2.01 |
| 14.600000000000305 | 2.01 | 2.01 |
| 14.616666666666973 | 2.01 | 2.01 |
| 14.63333333333364 | 2.01 | 2.01 |
| 14.650000000000308 | 2.01 | 2.01 |
| 14.666666666666975 | 2.01 | 2.01 |
| 14.683333333333643 | 2.01 | 2.01 |
| 14.70000000000031 | 2.01 | 2.01 |
| 14.716666666666978 | 2.01 | 2.01 |
| 14.733333333333645 | 2.01 | 2.01 |
| 14.750000000000313 | 2.01 | 2.01 |
| 14.76666666666698 | 2.01 | 2.01 |
| 14.783333333333648 | 2.01 | 2.01 |
| 14.800000000000315 | 2.01 | 2.01 |
| 14.816666666666983 | 2.01 | 2.01 |
| 14.83333333333365 | 2.01 | 2.01 |
| 14.850000000000318 | 2.01 | 2.01 |
| 14.866666666666985 | 2.01 | 2.01 |
| 14.883333333333653 | 2.01 | 2.01 |
| 14.90000000000032 | 2.01 | 2.01 |
| 14.916666666666988 | 2.01 | 2.01 |
| 14.933333333333655 | 2.01 | 2.01 |
| 14.950000000000323 | 2.01 | 2.01 |
| 14.96666666666699 | 2.01 | 2.01 |
| 14.983333333333658 | 2.01 | 2.01 |
| 15.000000000000325 | 2.01 | 2.01 |
| 15.016666666666993 | 2.01 | 2.01 |
| 15.03333333333366 | 2.01 | 2.01 |
| 15.050000000000328 | 2.01 | 2.01 |
| 15.066666666666995 | 2.01 | 2.01 |
| 15.083333333333663 | 2.01 | 2.01 |
| 15.10000000000033 | 2.01 | 2.01 |
| 15.116666666666998 | 2.01 | 2.01 |
| 15.133333333333665 | 2.01 | 2.01 |
| 15.150000000000333 | 2.01 | 2.01 |
| 15.166666666667 | 2.01 | 2.01 |
| 15.183333333333668 | 2.01 | 2.01 |
| 15.200000000000335 | 2.01 | 2.01 |
| 15.216666666667003 | 2.01 | 2.01 |
| 15.23333333333367 | 2.01 | 2.01 |
| 15.250000000000338 | 2.01 | 2.01 |
| 15.266666666667005 | 2.01 | 2.01 |
| 15.283333333333672 | 2.01 | 2.01 |
| 15.30000000000034 | 2.01 | 2.01 |
| 15.316666666667007 | 2.01 | 2.01 |
| 15.333333333333675 | 2.01 | 2.01 |
| 15.350000000000342 | 2.01 | 2.01 |
| 15.36666666666701 | 2.01 | 2.01 |
| 15.383333333333677 | 2.01 | 2.01 |
| 15.400000000000345 | 2.01 | 2.01 |
| 15.416666666667012 | 2.01 | 2.01 |
| 15.43333333333368 | 2.01 | 2.01 |
| 15.450000000000347 | 2.01 | 2.01 |
| 15.466666666667015 | 2.01 | 2.01 |
| 15.483333333333682 | 2.01 | 2.01 |
| 15.50000000000035 | 2.01 | 2.01 |
| 15.516666666667017 | 2.01 | 2.01 |
| 15.533333333333685 | 2.01 | 2.01 |
| 15.550000000000352 | 2.01 | 2.01 |
| 15.56666666666702 | 2.01 | 2.01 |
| 15.583333333333687 | 2.01 | 2.01 |
| 15.600000000000355 | 2.01 | 2.01 |
| 15.616666666667022 | 2.01 | 2.01 |
| 15.63333333333369 | 2.01 | 2.01 |
| 15.650000000000357 | 2.01 | 2.01 |
| 15.666666666667025 | 2.01 | 2.01 |
| 15.683333333333692 | 2.01 | 2.01 |
| 15.70000000000036 | 2.01 | 2.01 |
| 15.716666666667027 | 2.01 | 2.01 |
| 15.733333333333695 | 2.01 | 2.01 |
| 15.750000000000362 | 2.01 | 2.01 |
| 15.76666666666703 | 2.01 | 2.01 |
| 15.783333333333697 | 2.01 | 2.01 |
| 15.800000000000365 | 2.01 | 2.01 |
| 15.816666666667032 | 2.01 | 2.01 |
| 15.8333333333337 | 2.01 | 2.01 |
| 15.850000000000367 | 2.01 | 2.01 |
| 15.866666666667035 | 2.01 | 2.01 |
| 15.883333333333702 | 2.01 | 2.01 |
| 15.90000000000037 | 2.01 | 2.01 |
| 15.916666666667037 | 2.01 | 2.01 |
| 15.933333333333705 | 2.01 | 2.01 |
| 15.950000000000372 | 2.01 | 2.01 |
| 15.96666666666704 | 2.01 | 2.01 |
| 15.983333333333707 | 2.01 | 2.01 |
| 16.000000000000373 | 2.01 | 2.01 |
| 16.01666666666704 | 2.01 | 2.01 |
| 16.033333333333704 | 2.01 | 2.01 |
| 16.05000000000037 | 2.01 | 2.01 |
| 16.066666666667036 | 2.01 | 2.01 |
| 16.0833333333337 | 2.01 | 2.01 |
| 16.100000000000367 | 2.01 | 2.01 |
| 16.116666666667033 | 2.01 | 2.01 |
| 16.1333333333337 | 2.01 | 2.01 |
| 16.150000000000365 | 2.01 | 2.01 |
| 16.16666666666703 | 2.01 | 2.01 |
| 16.183333333333696 | 2.01 | 2.01 |
| 16.20000000000036 | 2.01 | 2.01 |
| 16.216666666667027 | 2.01 | 2.01 |
| 16.233333333333693 | 2.01 | 2.01 |
| 16.25000000000036 | 2.01 | 2.01 |
| 16.266666666667025 | 2.01 | 2.01 |
| 16.28333333333369 | 2.01 | 2.01 |
| 16.300000000000356 | 2.01 | 2.01 |
| 16.31666666666702 | 2.01 | 2.01 |
| 16.333333333333687 | 2.01 | 2.01 |
| 16.350000000000353 | 2.01 | 2.01 |
| 16.36666666666702 | 2.01 | 2.01 |
| 16.383333333333685 | 2.01 | 2.01 |
| 16.40000000000035 | 2.01 | 2.01 |
| 16.416666666667016 | 2.01 | 2.01 |
| 16.43333333333368 | 2.01 | 2.01 |
| 16.450000000000347 | 2.01 | 2.01 |
| 16.466666666667013 | 2.01 | 2.01 |
| 16.48333333333368 | 2.01 | 2.01 |
| 16.500000000000345 | 2.01 | 2.01 |
| 16.51666666666701 | 2.01 | 2.01 |
| 16.533333333333676 | 2.01 | 2.01 |
| 16.55000000000034 | 2.01 | 2.01 |
| 16.566666666667007 | 2.01 | 2.01 |
| 16.583333333333673 | 2.01 | 2.01 |
| 16.60000000000034 | 2.01 | 2.01 |
| 16.616666666667005 | 2.01 | 2.01 |
| 16.63333333333367 | 2.01 | 2.01 |
| 16.650000000000336 | 2.01 | 2.01 |
| 16.666666666667002 | 2.01 | 2.01 |
| 16.683333333333668 | 2.01 | 2.01 |
| 16.700000000000333 | 2.01 | 2.01 |
| 16.716666666667 | 2.01 | 2.01 |
| 16.733333333333665 | 2.01 | 2.01 |
| 16.75000000000033 | 2.01 | 2.01 |
| 16.766666666666996 | 2.01 | 2.01 |
| 16.783333333333662 | 2.01 | 2.01 |
| 16.800000000000328 | 2.01 | 2.01 |
| 16.816666666666993 | 2.01 | 2.01 |
| 16.83333333333366 | 2.01 | 2.01 |
| 16.850000000000325 | 2.01 | 2.01 |
| 16.86666666666699 | 2.01 | 2.01 |
| 16.883333333333656 | 2.01 | 2.01 |
| 16.900000000000322 | 2.01 | 2.01 |
| 16.916666666666988 | 2.01 | 2.01 |
| 16.933333333333653 | 2.01 | 2.01 |
| 16.95000000000032 | 2.01 | 2.01 |
| 16.966666666666985 | 2.01 | 2.01 |
| 16.98333333333365 | 2.01 | 2.01 |
| 17.000000000000316 | 2.01 | 2.01 |
| 17.016666666666982 | 2.01 | 2.01 |
| 17.033333333333648 | 2.01 | 2.01 |
| 17.050000000000313 | 2.01 | 2.01 |
| 17.06666666666698 | 2.01 | 2.01 |
| 17.083333333333645 | 2.01 | 2.01 |
| 17.10000000000031 | 2.01 | 2.01 |
| 17.116666666666976 | 2.01 | 2.01 |
| 17.133333333333642 | 2.01 | 2.01 |
| 17.150000000000308 | 2.01 | 2.01 |
| 17.166666666666973 | 2.01 | 2.01 |
| 17.18333333333364 | 2.01 | 2.01 |
| 17.200000000000305 | 2.01 | 2.01 |
| 17.21666666666697 | 2.01 | 2.01 |
| 17.233333333333636 | 2.01 | 2.01 |
| 17.250000000000302 | 2.01 | 2.01 |
| 17.266666666666968 | 2.01 | 2.01 |
| 17.283333333333633 | 2.01 | 2.01 |
| 17.3000000000003 | 2.01 | 2.01 |
| 17.316666666666965 | 2.01 | 2.01 |
| 17.33333333333363 | 2.01 | 2.01 |
| 17.350000000000296 | 2.01 | 2.01 |
| 17.366666666666962 | 2.01 | 2.01 |
| 17.383333333333628 | 2.01 | 2.01 |
| 17.400000000000293 | 2.01 | 2.01 |
| 17.41666666666696 | 2.01 | 2.01 |
| 17.433333333333625 | 2.01 | 2.01 |
| 17.45000000000029 | 2.01 | 2.01 |
| 17.466666666666956 | 2.01 | 2.01 |
| 17.483333333333622 | 2.01 | 2.01 |
| 17.500000000000288 | 2.01 | 2.01 |
| 17.516666666666953 | 2.01 | 2.01 |
| 17.53333333333362 | 2.01 | 2.01 |
| 17.550000000000285 | 2.01 | 2.01 |
| 17.56666666666695 | 2.01 | 2.01 |
| 17.583333333333616 | 2.01 | 2.01 |
| 17.600000000000282 | 2.01 | 2.01 |
| 17.616666666666948 | 2.01 | 2.01 |
| 17.633333333333614 | 2.01 | 2.01 |
| 17.65000000000028 | 2.01 | 2.01 |
| 17.666666666666945 | 2.01 | 2.01 |
| 17.68333333333361 | 2.01 | 2.01 |
| 17.700000000000276 | 2.01 | 2.01 |
| 17.716666666666942 | 2.01 | 2.01 |
| 17.733333333333608 | 2.01 | 2.01 |
| 17.750000000000274 | 2.01 | 2.01 |
| 17.76666666666694 | 2.01 | 2.01 |
| 17.783333333333605 | 2.01 | 2.01 |
| 17.80000000000027 | 2.01 | 2.01 |
| 17.816666666666936 | 2.01 | 2.01 |
| 17.833333333333602 | 2.01 | 2.01 |
| 17.850000000000268 | 2.01 | 2.01 |
| 17.866666666666934 | 2.01 | 2.01 |
| 17.8833333333336 | 2.01 | 2.01 |
| 17.900000000000265 | 2.01 | 2.01 |
| 17.91666666666693 | 2.01 | 2.01 |
| 17.933333333333596 | 2.01 | 2.01 |
| 17.950000000000262 | 2.01 | 2.01 |
| 17.966666666666928 | 2.01 | 2.01 |
| 17.983333333333594 | 2.01 | 2.01 |
| 18.00000000000026 | 2.01 | 2.01 |
| 18.016666666666925 | 2.01 | 2.01 |
| 18.03333333333359 | 2.01 | 2.01 |
| 18.050000000000257 | 2.01 | 2.01 |
| 18.066666666666922 | 2.01 | 2.01 |
| 18.083333333333588 | 2.01 | 2.01 |
| 18.100000000000254 | 2.01 | 2.01 |
| 18.11666666666692 | 2.01 | 2.01 |
| 18.133333333333585 | 2.01 | 2.01 |
| 18.15000000000025 | 2.01 | 2.01 |
| 18.166666666666917 | 2.01 | 2.01 |
| 18.183333333333582 | 2.01 | 2.01 |
| 18.200000000000248 | 2.01 | 2.01 |
| 18.216666666666914 | 2.01 | 2.01 |
| 18.23333333333358 | 2.01 | 2.01 |
| 18.250000000000245 | 2.01 | 2.01 |
| 18.26666666666691 | 2.01 | 2.01 |
| 18.283333333333577 | 2.01 | 2.01 |
| 18.300000000000242 | 2.01 | 2.01 |
| 18.316666666666908 | 2.01 | 2.01 |
| 18.333333333333574 | 2.01 | 2.01 |
| 18.35000000000024 | 2.01 | 2.01 |
| 18.366666666666905 | 2.01 | 2.01 |
| 18.38333333333357 | 2.01 | 2.01 |
| 18.400000000000237 | 2.01 | 2.01 |
| 18.416666666666902 | 2.01 | 2.01 |
| 18.433333333333568 | 2.01 | 2.01 |
| 18.450000000000234 | 2.01 | 2.01 |
| 18.4666666666669 | 2.01 | 2.01 |
| 18.483333333333565 | 2.01 | 2.01 |
| 18.50000000000023 | 2.01 | 2.01 |
| 18.516666666666897 | 2.01 | 2.01 |
| 18.533333333333562 | 2.01 | 2.01 |
| 18.550000000000228 | 2.01 | 2.01 |
| 18.566666666666894 | 2.01 | 2.01 |
| 18.58333333333356 | 2.01 | 2.01 |
| 18.600000000000225 | 2.01 | 2.01 |
| 18.61666666666689 | 2.01 | 2.01 |
| 18.633333333333557 | 2.01 | 2.01 |
| 18.650000000000222 | 2.01 | 2.01 |
| 18.666666666666888 | 2.01 | 2.01 |
| 18.683333333333554 | 2.01 | 2.01 |
| 18.70000000000022 | 2.01 | 2.01 |
| 18.716666666666885 | 2.01 | 2.01 |
| 18.73333333333355 | 2.01 | 2.01 |
| 18.750000000000217 | 2.01 | 2.01 |
| 18.766666666666882 | 2.01 | 2.01 |
| 18.783333333333548 | 2.01 | 2.01 |
| 18.800000000000214 | 2.01 | 2.01 |
| 18.81666666666688 | 2.01 | 2.01 |
| 18.833333333333545 | 2.01 | 2.01 |
| 18.85000000000021 | 2.01 | 2.01 |
| 18.866666666666877 | 2.01 | 2.01 |
| 18.883333333333542 | 2.01 | 2.01 |
| 18.900000000000208 | 2.01 | 2.01 |
| 18.916666666666874 | 2.01 | 2.01 |
| 18.93333333333354 | 2.01 | 2.01 |
| 18.950000000000205 | 2.01 | 2.01 |
| 18.96666666666687 | 2.01 | 2.01 |
| 18.983333333333537 | 2.01 | 2.01 |
| 19.000000000000203 | 2.01 | 2.01 |
| 19.01666666666687 | 2.01 | 2.01 |
| 19.033333333333534 | 2.01 | 2.01 |
| 19.0500000000002 | 2.01 | 2.01 |
| 19.066666666666865 | 2.01 | 2.01 |
| 19.08333333333353 | 2.01 | 2.01 |
| 19.100000000000197 | 2.01 | 2.01 |
| 19.116666666666863 | 2.01 | 2.01 |
| 19.13333333333353 | 2.01 | 2.01 |
| 19.150000000000194 | 2.01 | 2.01 |
| 19.16666666666686 | 2.01 | 2.01 |
| 19.183333333333525 | 2.01 | 2.01 |
| 19.20000000000019 | 2.01 | 2.01 |
| 19.216666666666857 | 2.01 | 2.01 |
| 19.233333333333523 | 2.01 | 2.01 |
| 19.25000000000019 | 2.01 | 2.01 |
| 19.266666666666854 | 2.01 | 2.01 |
| 19.28333333333352 | 2.01 | 2.01 |
| 19.300000000000185 | 2.01 | 2.01 |
| 19.31666666666685 | 2.01 | 2.01 |
| 19.333333333333517 | 2.01 | 2.01 |
| 19.350000000000183 | 2.01 | 2.01 |
| 19.36666666666685 | 2.01 | 2.01 |
| 19.383333333333514 | 2.01 | 2.01 |
| 19.40000000000018 | 2.01 | 2.01 |
| 19.416666666666845 | 2.01 | 2.01 |
| 19.43333333333351 | 2.01 | 2.01 |
| 19.450000000000177 | 2.01 | 2.01 |
| 19.466666666666843 | 2.01 | 2.01 |
| 19.48333333333351 | 2.01 | 2.01 |
| 19.500000000000174 | 2.01 | 2.01 |
| 19.51666666666684 | 2.01 | 2.01 |
| 19.533333333333506 | 2.01 | 2.01 |
| 19.55000000000017 | 2.01 | 2.01 |
| 19.566666666666837 | 2.01 | 2.01 |
| 19.583333333333503 | 2.01 | 2.01 |
| 19.60000000000017 | 2.01 | 2.01 |
| 19.616666666666834 | 2.01 | 2.01 |
| 19.6333333333335 | 2.01 | 2.01 |
| 19.650000000000166 | 2.01 | 2.01 |
| 19.66666666666683 | 2.01 | 2.01 |
| 19.683333333333497 | 2.01 | 2.01 |
| 19.700000000000163 | 2.01 | 2.01 |
| 19.71666666666683 | 2.01 | 2.01 |
| 19.733333333333494 | 2.01 | 2.01 |
| 19.75000000000016 | 2.01 | 2.01 |
| 19.766666666666826 | 2.01 | 2.01 |
| 19.78333333333349 | 2.01 | 2.01 |
| 19.800000000000157 | 2.01 | 2.01 |
| 19.816666666666823 | 2.01 | 2.01 |
| 19.83333333333349 | 2.01 | 2.01 |
| 19.850000000000154 | 2.01 | 2.01 |
| 19.86666666666682 | 2.01 | 2.01 |
| 19.883333333333486 | 2.01 | 2.01 |
| 19.90000000000015 | 2.01 | 2.01 |
| 19.916666666666817 | 2.01 | 2.01 |
| 19.933333333333483 | 2.01 | 2.01 |
| 19.95000000000015 | 2.01 | 2.01 |
| 19.966666666666814 | 2.01 | 2.01 |
| 19.98333333333348 | 2.01 | 2.01 |
| 20.000000000000146 | 2.01 | 2.01 |
| 20.01666666666681 | 2.01 | 2.01 |
| 20.033333333333477 | 2.01 | 2.01 |
| 20.050000000000143 | 2.01 | 2.01 |
| 20.06666666666681 | 2.01 | 2.01 |
| 20.083333333333474 | 2.01 | 2.01 |
| 20.10000000000014 | 2.01 | 2.01 |
| 20.116666666666806 | 2.01 | 2.01 |
| 20.13333333333347 | 2.01 | 2.01 |
| 20.150000000000137 | 2.01 | 2.01 |
| 20.166666666666803 | 2.01 | 2.01 |
| 20.18333333333347 | 2.01 | 2.01 |
| 20.200000000000134 | 2.01 | 2.01 |
| 20.2166666666668 | 2.01 | 2.01 |
| 20.233333333333466 | 2.01 | 2.01 |
| 20.25000000000013 | 2.01 | 2.01 |
| 20.266666666666797 | 2.01 | 2.01 |
| 20.283333333333463 | 2.01 | 2.01 |
| 20.30000000000013 | 2.01 | 2.01 |
| 20.316666666666794 | 2.01 | 2.01 |
| 20.33333333333346 | 2.01 | 2.01 |
| 20.350000000000126 | 2.01 | 2.01 |
| 20.36666666666679 | 2.01 | 2.01 |
| 20.383333333333457 | 2.01 | 2.01 |
| 20.400000000000123 | 2.01 | 2.01 |
| 20.41666666666679 | 2.01 | 2.01 |
| 20.433333333333454 | 2.01 | 2.01 |
| 20.45000000000012 | 2.01 | 2.01 |
| 20.466666666666786 | 2.01 | 2.01 |
| 20.48333333333345 | 2.01 | 2.01 |
| 20.500000000000117 | 2.01 | 2.01 |
| 20.516666666666783 | 2.01 | 2.01 |
| 20.53333333333345 | 2.01 | 2.01 |
| 20.550000000000114 | 2.01 | 2.01 |
| 20.56666666666678 | 2.01 | 2.01 |
| 20.583333333333446 | 2.01 | 2.01 |
| 20.60000000000011 | 2.01 | 2.01 |
| 20.616666666666777 | 2.01 | 2.01 |
| 20.633333333333443 | 2.01 | 2.01 |
| 20.65000000000011 | 2.01 | 2.01 |
| 20.666666666666774 | 2.01 | 2.01 |
| 20.68333333333344 | 2.01 | 2.01 |
| 20.700000000000106 | 2.01 | 2.01 |
| 20.71666666666677 | 2.01 | 2.01 |
| 20.733333333333437 | 2.01 | 2.01 |
| 20.750000000000103 | 2.01 | 2.01 |
| 20.76666666666677 | 2.01 | 2.01 |
| 20.783333333333434 | 2.01 | 2.01 |
| 20.8000000000001 | 2.01 | 2.01 |
| 20.816666666666766 | 2.01 | 2.01 |
| 20.83333333333343 | 2.01 | 2.01 |
| 20.850000000000097 | 2.01 | 2.01 |
| 20.866666666666763 | 2.01 | 2.01 |
| 20.88333333333343 | 2.01 | 2.01 |
| 20.900000000000095 | 2.01 | 2.01 |
| 20.91666666666676 | 2.01 | 2.01 |
| 20.933333333333426 | 2.01 | 2.01 |
| 20.95000000000009 | 2.01 | 2.01 |
| 20.966666666666757 | 2.01 | 2.01 |
| 20.983333333333423 | 2.01 | 2.01 |
| 21.00000000000009 | 2.01 | 2.01 |
| 21.016666666666755 | 2.01 | 2.01 |
| 21.03333333333342 | 2.01 | 2.01 |
| 21.050000000000086 | 2.01 | 2.01 |
| 21.06666666666675 | 2.01 | 2.01 |
| 21.083333333333417 | 2.01 | 2.01 |
| 21.100000000000083 | 2.01 | 2.01 |
| 21.11666666666675 | 2.01 | 2.01 |
| 21.133333333333415 | 2.01 | 2.01 |
| 21.15000000000008 | 2.01 | 2.01 |
| 21.166666666666746 | 2.01 | 2.01 |
| 21.18333333333341 | 2.01 | 2.01 |
| 21.200000000000077 | 2.01 | 2.01 |
| 21.216666666666743 | 2.01 | 2.01 |
| 21.23333333333341 | 2.01 | 2.01 |
| 21.250000000000075 | 2.01 | 2.01 |
| 21.26666666666674 | 2.01 | 2.01 |
| 21.283333333333406 | 2.01 | 2.01 |
| 21.30000000000007 | 2.01 | 2.01 |
| 21.316666666666737 | 2.01 | 2.01 |
| 21.333333333333403 | 2.01 | 2.01 |
| 21.35000000000007 | 2.01 | 2.01 |
| 21.366666666666735 | 2.01 | 2.01 |
| 21.3833333333334 | 2.01 | 2.01 |
| 21.400000000000066 | 2.01 | 2.01 |
| 21.416666666666732 | 2.01 | 2.01 |
| 21.433333333333398 | 2.01 | 2.01 |
| 21.450000000000063 | 2.01 | 2.01 |
| 21.46666666666673 | 2.01 | 2.01 |
| 21.483333333333395 | 2.01 | 2.01 |
| 21.50000000000006 | 2.01 | 2.01 |
| 21.516666666666726 | 2.01 | 2.01 |
| 21.533333333333392 | 2.01 | 2.01 |
| 21.550000000000058 | 2.01 | 2.01 |
| 21.566666666666723 | 2.01 | 2.01 |
| 21.58333333333339 | 2.01 | 2.01 |
| 21.600000000000055 | 2.01 | 2.01 |
| 21.61666666666672 | 2.01 | 2.01 |
| 21.633333333333386 | 2.01 | 2.01 |
| 21.650000000000052 | 2.01 | 2.01 |
| 21.666666666666718 | 2.01 | 2.01 |
| 21.683333333333383 | 2.01 | 2.01 |
| 21.70000000000005 | 2.01 | 2.01 |
| 21.716666666666715 | 2.01 | 2.01 |
| 21.73333333333338 | 2.01 | 2.01 |
| 21.750000000000046 | 2.01 | 2.01 |
| 21.766666666666712 | 2.01 | 2.01 |
| 21.783333333333378 | 2.01 | 2.01 |
| 21.800000000000043 | 2.01 | 2.01 |
| 21.81666666666671 | 2.01 | 2.01 |
| 21.833333333333375 | 2.01 | 2.01 |
| 21.85000000000004 | 2.01 | 2.01 |
| 21.866666666666706 | 2.01 | 2.01 |
| 21.883333333333372 | 2.01 | 2.01 |
| 21.900000000000038 | 2.01 | 2.01 |
| 21.916666666666703 | 2.01 | 2.01 |
| 21.93333333333337 | 2.01 | 2.01 |
| 21.950000000000035 | 2.01 | 2.01 |
| 21.9666666666667 | 2.01 | 2.01 |
| 21.983333333333366 | 2.01 | 2.01 |
| 22.000000000000032 | 2.01 | 2.01 |
| 22.016666666666698 | 2.01 | 2.01 |
| 22.033333333333363 | 2.01 | 2.01 |
| 22.05000000000003 | 2.01 | 2.01 |
| 22.066666666666695 | 2.01 | 2.01 |
| 22.08333333333336 | 2.01 | 2.01 |
| 22.100000000000026 | 2.01 | 2.01 |
| 22.116666666666692 | 2.01 | 2.01 |
| 22.133333333333358 | 2.01 | 2.01 |
| 22.150000000000023 | 2.01 | 2.01 |
| 22.16666666666669 | 2.01 | 2.01 |
| 22.183333333333355 | 2.01 | 2.01 |
| 22.20000000000002 | 2.01 | 2.01 |
| 22.216666666666686 | 2.01 | 2.01 |
| 22.233333333333352 | 2.01 | 2.01 |
| 22.250000000000018 | 2.01 | 2.01 |
| 22.266666666666683 | 2.01 | 2.01 |
| 22.28333333333335 | 2.01 | 2.01 |
| 22.300000000000015 | 2.01 | 2.01 |
| 22.31666666666668 | 2.01 | 2.01 |
| 22.333333333333346 | 2.01 | 2.01 |
| 22.350000000000012 | 2.01 | 2.01 |
| 22.366666666666678 | 2.01 | 2.01 |
| 22.383333333333344 | 2.01 | 2.01 |
| 22.40000000000001 | 2.01 | 2.01 |
| 22.416666666666675 | 2.01 | 2.01 |
| 22.43333333333334 | 2.01 | 2.01 |
| 22.450000000000006 | 2.01 | 2.01 |
| 22.466666666666672 | 2.01 | 2.01 |
| 22.483333333333338 | 2.01 | 2.01 |
| 22.500000000000004 | 2.01 | 2.01 |
| 22.51666666666667 | 2.01 | 2.01 |
| 22.533333333333335 | 2.01 | 2.01 |
| 22.55 | 2.01 | 2.01 |
| 22.566666666666666 | 2.01 | 2.01 |
| 22.583333333333332 | 2.01 | 2.01 |
| 22.599999999999998 | 2.01 | 2.01 |
| 22.616666666666664 | 2.01 | 2.01 |
| 22.63333333333333 | 2.01 | 2.01 |
| 22.649999999999995 | 2.01 | 2.01 |
| 22.66666666666666 | 2.01 | 2.01 |
| 22.683333333333326 | 2.01 | 2.01 |
| 22.699999999999992 | 2.01 | 2.01 |
| 22.716666666666658 | 2.01 | 2.01 |
| 22.733333333333324 | 2.01 | 2.01 |
| 22.74999999999999 | 2.01 | 2.01 |
| 22.766666666666655 | 2.01 | 2.01 |
| 22.78333333333332 | 2.01 | 2.01 |
| 22.799999999999986 | 2.01 | 2.01 |
| 22.816666666666652 | 2.01 | 2.01 |
| 22.833333333333318 | 2.01 | 2.01 |
| 22.849999999999984 | 2.01 | 2.01 |
| 22.86666666666665 | 2.01 | 2.01 |
| 22.883333333333315 | 2.01 | 2.01 |
| 22.89999999999998 | 2.01 | 2.01 |
| 22.916666666666647 | 2.01 | 2.01 |
| 22.933333333333312 | 2.01 | 2.01 |
| 22.949999999999978 | 2.01 | 2.01 |
| 22.966666666666644 | 2.01 | 2.01 |
| 22.98333333333331 | 2.01 | 2.01 |
| 22.999999999999975 | 2.01 | 2.01 |
| 23.01666666666664 | 2.01 | 2.01 |
| 23.033333333333307 | 2.01 | 2.01 |
| 23.049999999999972 | 2.01 | 2.01 |
| 23.066666666666638 | 2.01 | 2.01 |
| 23.083333333333304 | 2.01 | 2.01 |
| 23.09999999999997 | 2 | 2 |
| 23.116666666666635 | 2 | 2 |
| 23.1333333333333 | 2 | 2 |
| 23.149999999999967 | 2 | 2 |
| 23.166666666666632 | 2 | 2 |
| 23.183333333333298 | 2 | 2 |
| 23.199999999999964 | 2 | 2 |
| 23.21666666666663 | 2 | 2 |
| 23.233333333333295 | 2 | 2 |
| 23.24999999999996 | 2 | 2 |
| 23.266666666666627 | 2 | 2 |
| 23.283333333333292 | 2 | 2 |
| 23.299999999999958 | 2 | 2 |
| 23.316666666666624 | 2 | 2 |
| 23.33333333333329 | 2 | 2 |
| 23.349999999999955 | 2 | 2 |
| 23.36666666666662 | 2 | 2 |
| 23.383333333333287 | 2 | 2 |
| 23.399999999999952 | 2 | 2 |
| 23.416666666666618 | 2 | 2 |
| 23.433333333333284 | 2 | 2 |
| 23.44999999999995 | 2 | 2 |
| 23.466666666666615 | 2 | 2 |
| 23.48333333333328 | 2 | 2 |
| 23.499999999999947 | 2 | 2 |
| 23.516666666666612 | 2 | 2 |
| 23.533333333333278 | 2 | 2 |
| 23.549999999999944 | 2 | 2 |
| 23.56666666666661 | 2 | 2 |
| 23.583333333333275 | 2 | 2 |
| 23.59999999999994 | 2 | 2 |
| 23.616666666666607 | 2 | 2 |
| 23.633333333333272 | 2 | 2 |
| 23.649999999999938 | 2 | 2 |
| 23.666666666666604 | 2 | 2 |
| 23.68333333333327 | 2 | 2 |
| 23.699999999999935 | 2 | 2 |
| 23.7166666666666 | 2 | 2 |
| 23.733333333333267 | 2 | 2 |
| 23.749999999999932 | 2 | 2 |
| 23.766666666666598 | 2 | 2 |
| 23.783333333333264 | 2 | 2 |
| 23.79999999999993 | 2 | 2 |
| 23.816666666666595 | 2 | 2 |
| 23.83333333333326 | 2 | 2 |
| 23.849999999999927 | 2 | 2 |
| 23.866666666666593 | 2 | 2 |
| 23.88333333333326 | 2 | 2 |
| 23.899999999999924 | 2 | 2 |
| 23.91666666666659 | 2 | 2 |
| 23.933333333333255 | 2 | 2 |
| 23.94999999999992 | 2 | 2 |
| 23.966666666666587 | 2 | 2 |
| 23.983333333333253 | 2 | 2 |
| 23.99999999999992 | 2.01 | 2.01 |
| 24.016666666666584 | 2.01 | 2.01 |
| 24.03333333333325 | 2.01 | 2.01 |
| 24.049999999999915 | 2.01 | 2.01 |
| 24.06666666666658 | 2.01 | 2.01 |
| 24.083333333333247 | 2.01 | 2.01 |
| 24.099999999999913 | 2.01 | 2.01 |
| 24.11666666666658 | 2.01 | 2.01 |
| 24.133333333333244 | 2.01 | 2.01 |
| 24.14999999999991 | 2.01 | 2.01 |
| 24.166666666666575 | 2.01 | 2.01 |
| 24.18333333333324 | 2.01 | 2.01 |
| 24.199999999999907 | 2.01 | 2.01 |
| 24.216666666666573 | 2.01 | 2.01 |
| 24.23333333333324 | 2.01 | 2.01 |
| 24.249999999999904 | 2.01 | 2.01 |
| 24.26666666666657 | 2.01 | 2.01 |
| 24.283333333333236 | 2.01 | 2.01 |
| 24.2999999999999 | 2.01 | 2.01 |
| 24.316666666666567 | 2.01 | 2.01 |
| 24.333333333333233 | 2.01 | 2.01 |
| 24.3499999999999 | 2.01 | 2.01 |
| 24.366666666666564 | 2.01 | 2.01 |
| 24.38333333333323 | 2.01 | 2.01 |
| 24.399999999999896 | 2.01 | 2.01 |
| 24.41666666666656 | 2.01 | 2.01 |
| 24.433333333333227 | 2.01 | 2.01 |
| 24.449999999999893 | 2.01 | 2.01 |
| 24.46666666666656 | 2.01 | 2.01 |
| 24.483333333333224 | 2.01 | 2.01 |
| 24.49999999999989 | 2.01 | 2.01 |
| 24.516666666666556 | 2.01 | 2.01 |
| 24.53333333333322 | 2.01 | 2.01 |
| 24.549999999999887 | 2.01 | 2.01 |
| 24.566666666666553 | 2.01 | 2.01 |
| 24.58333333333322 | 2.01 | 2.01 |
| 24.599999999999884 | 2.01 | 2.01 |
| 24.61666666666655 | 2.01 | 2.01 |
| 24.633333333333216 | 2.01 | 2.01 |
| 24.64999999999988 | 2.01 | 2.01 |
| 24.666666666666547 | 2.01 | 2.01 |
| 24.683333333333213 | 2.01 | 2.01 |
| 24.69999999999988 | 2.01 | 2.01 |
| 24.716666666666544 | 2.01 | 2.01 |
| 24.73333333333321 | 2.01 | 2.01 |
| 24.749999999999876 | 2.01 | 2.01 |
| 24.76666666666654 | 2.01 | 2.01 |
| 24.783333333333207 | 2.01 | 2.01 |
| 24.799999999999873 | 2.01 | 2.01 |
| 24.81666666666654 | 2.01 | 2.01 |
| 24.833333333333204 | 2.01 | 2.01 |
| 24.84999999999987 | 2.01 | 2.01 |
| 24.866666666666536 | 2.01 | 2.01 |
| 24.8833333333332 | 2.01 | 2.01 |
| 24.899999999999867 | 2.01 | 2.01 |
| 24.916666666666533 | 2.01 | 2.01 |
| 24.9333333333332 | 2.01 | 2.01 |
| 24.949999999999864 | 2.01 | 2.01 |
| 24.96666666666653 | 2.01 | 2.01 |
| 24.983333333333196 | 2.01 | 2.01 |
| 24.99999999999986 | 2.01 | 2.01 |